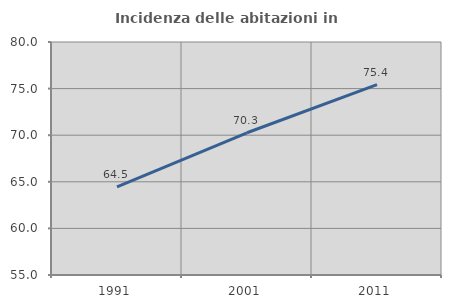
| Category | Incidenza delle abitazioni in proprietà  |
|---|---|
| 1991.0 | 64.452 |
| 2001.0 | 70.26 |
| 2011.0 | 75.435 |